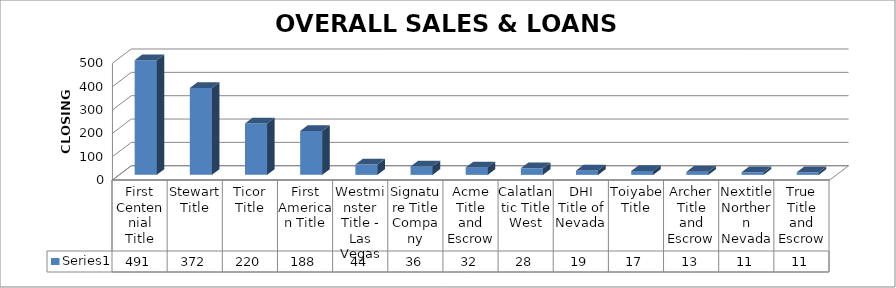
| Category | Series 0 |
|---|---|
| First Centennial Title | 491 |
| Stewart Title | 372 |
| Ticor Title | 220 |
| First American Title | 188 |
| Westminster Title - Las Vegas | 44 |
| Signature Title Company | 36 |
| Acme Title and Escrow | 32 |
| Calatlantic Title West | 28 |
| DHI Title of Nevada | 19 |
| Toiyabe Title | 17 |
| Archer Title and Escrow | 13 |
| Nextitle Northern Nevada | 11 |
| True Title and Escrow | 11 |